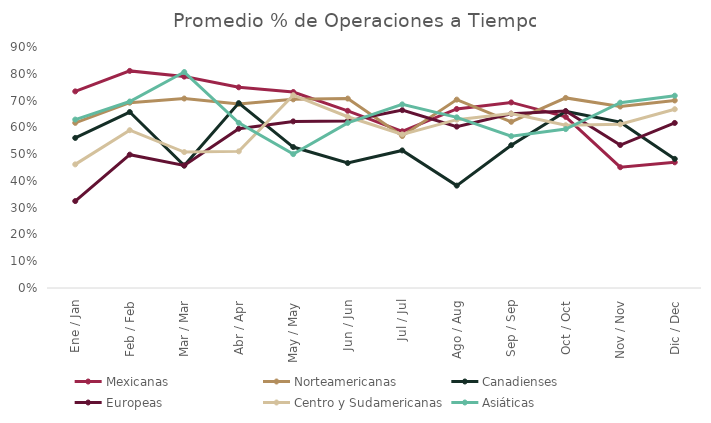
| Category | Mexicanas | Norteamericanas | Canadienses | Europeas | Centro y Sudamericanas | Asiáticas |
|---|---|---|---|---|---|---|
| Ene / Jan | 0.734 | 0.617 | 0.56 | 0.325 | 0.462 | 0.629 |
| Feb / Feb | 0.811 | 0.692 | 0.657 | 0.498 | 0.589 | 0.696 |
| Mar / Mar | 0.789 | 0.708 | 0.457 | 0.458 | 0.508 | 0.806 |
| Abr / Apr | 0.749 | 0.687 | 0.69 | 0.595 | 0.51 | 0.617 |
| May / May | 0.732 | 0.705 | 0.526 | 0.622 | 0.72 | 0.5 |
| Jun / Jun | 0.662 | 0.707 | 0.467 | 0.624 | 0.64 | 0.617 |
| Jul / Jul | 0.585 | 0.568 | 0.514 | 0.664 | 0.574 | 0.686 |
| Ago / Aug | 0.669 | 0.704 | 0.382 | 0.603 | 0.629 | 0.637 |
| Sep / Sep | 0.693 | 0.621 | 0.533 | 0.651 | 0.651 | 0.567 |
| Oct / Oct | 0.639 | 0.71 | 0.659 | 0.661 | 0.608 | 0.593 |
| Nov / Nov | 0.451 | 0.678 | 0.619 | 0.534 | 0.611 | 0.692 |
| Dic / Dec | 0.469 | 0.7 | 0.482 | 0.616 | 0.668 | 0.718 |